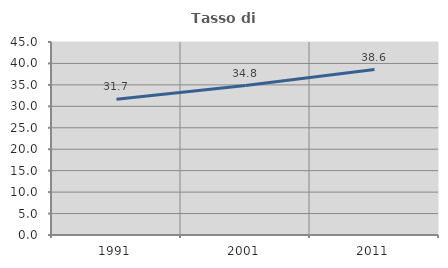
| Category | Tasso di occupazione   |
|---|---|
| 1991.0 | 31.66 |
| 2001.0 | 34.841 |
| 2011.0 | 38.576 |